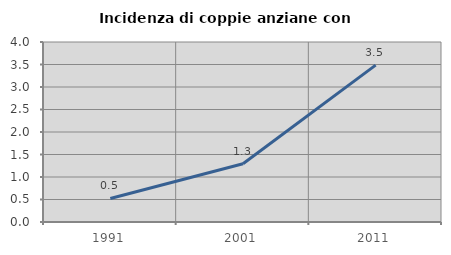
| Category | Incidenza di coppie anziane con figli |
|---|---|
| 1991.0 | 0.524 |
| 2001.0 | 1.295 |
| 2011.0 | 3.486 |